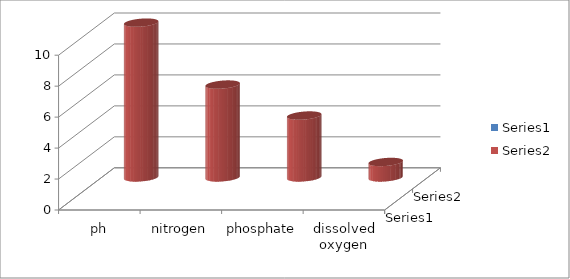
| Category | Series 0 | Series 1 |
|---|---|---|
| ph |  | 10 |
| nitrogen |  | 6 |
| phosphate |  | 4 |
| dissolved oxygen |  | 1 |